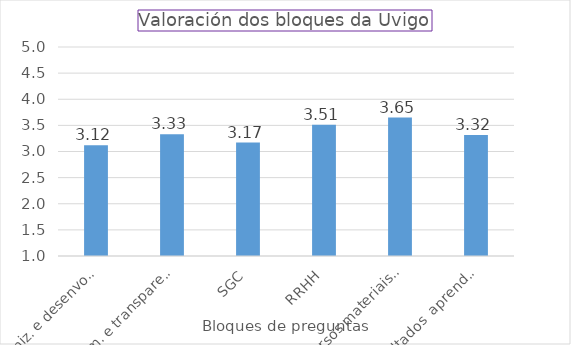
| Category | Series 0 |
|---|---|
| Organiz. e desenvolv. | 3.118 |
| Inform. e transparencia | 3.331 |
| SGC | 3.17 |
| RRHH | 3.514 |
| Recursos materiais e servizos | 3.649 |
| Resultados  aprendizaxe | 3.316 |